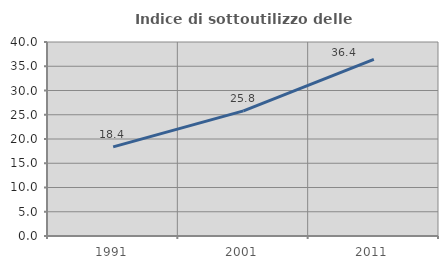
| Category | Indice di sottoutilizzo delle abitazioni  |
|---|---|
| 1991.0 | 18.371 |
| 2001.0 | 25.795 |
| 2011.0 | 36.427 |